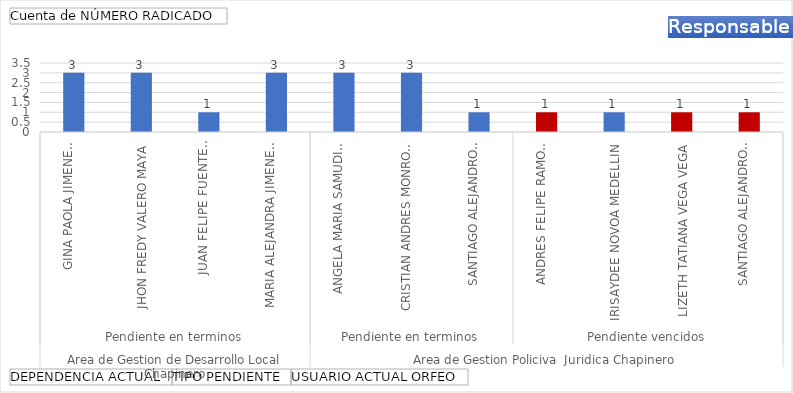
| Category | Total |
|---|---|
| 0 | 3 |
| 1 | 3 |
| 2 | 1 |
| 3 | 3 |
| 4 | 3 |
| 5 | 3 |
| 6 | 1 |
| 7 | 1 |
| 8 | 1 |
| 9 | 1 |
| 10 | 1 |